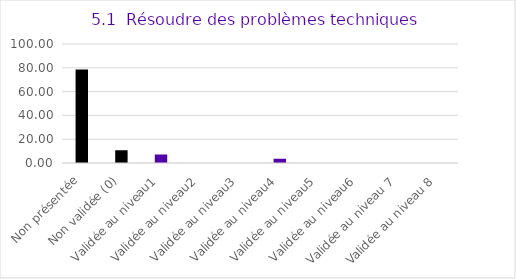
| Category | Series 0 |
|---|---|
| Non présentée | 78.571 |
| Non validée (0) | 10.714 |
| Validée au niveau1 | 7.143 |
| Validée au niveau2 | 0 |
| Validée au niveau3 | 0 |
| Validée au niveau4 | 3.571 |
| Validée au niveau5 | 0 |
| Validée au niveau6 | 0 |
| Validée au niveau 7 | 0 |
| Validée au niveau 8 | 0 |